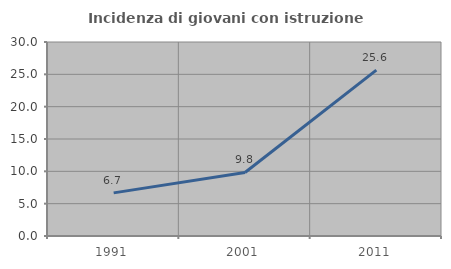
| Category | Incidenza di giovani con istruzione universitaria |
|---|---|
| 1991.0 | 6.667 |
| 2001.0 | 9.821 |
| 2011.0 | 25.641 |